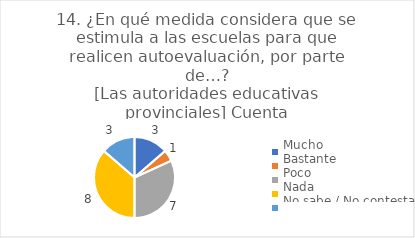
| Category | 14. ¿En qué medida considera que se estimula a las escuelas para que realicen autoevaluación, por parte de…?
[Las autoridades educativas provinciales] |
|---|---|
| Mucho  | 0.136 |
| Bastante  | 0.045 |
| Poco  | 0.318 |
| Nada  | 0.364 |
| No sabe / No contesta | 0.136 |